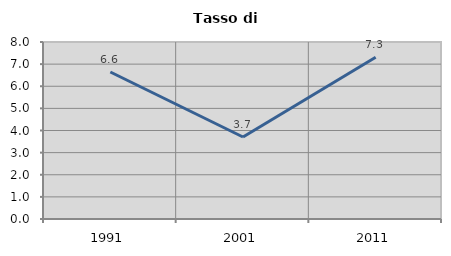
| Category | Tasso di disoccupazione   |
|---|---|
| 1991.0 | 6.643 |
| 2001.0 | 3.707 |
| 2011.0 | 7.312 |